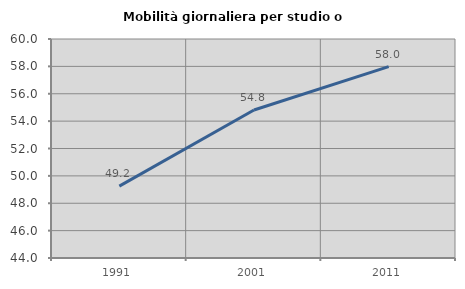
| Category | Mobilità giornaliera per studio o lavoro |
|---|---|
| 1991.0 | 49.249 |
| 2001.0 | 54.817 |
| 2011.0 | 57.985 |